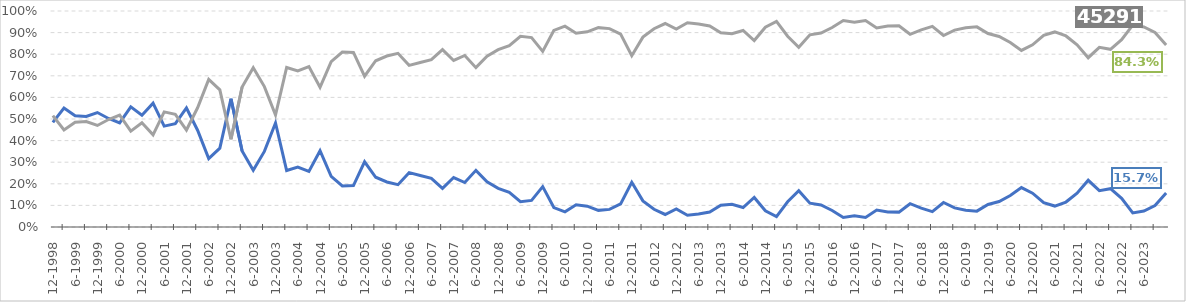
| Category | Belgium | Outside Belgium |
|---|---|---|
| 1998-12-01 | 48.4 | 51.6 |
| 1999-03-01 | 55.05 | 44.95 |
| 1999-06-01 | 51.5 | 48.5 |
| 1999-09-01 | 51.2 | 48.8 |
| 1999-12-01 | 53 | 47 |
| 2000-03-01 | 50.25 | 49.75 |
| 2000-06-01 | 48.2 | 51.8 |
| 2000-09-01 | 55.6 | 44.4 |
| 2000-12-01 | 51.75 | 48.25 |
| 2001-03-01 | 57.35 | 42.65 |
| 2001-06-01 | 46.7 | 53.3 |
| 2001-09-01 | 47.85 | 52.15 |
| 2001-12-01 | 55.1 | 44.9 |
| 2002-03-01 | 44.8 | 55.2 |
| 2002-06-01 | 31.65 | 68.35 |
| 2002-09-01 | 36.5 | 63.5 |
| 2002-12-01 | 59.4 | 40.6 |
| 2003-03-01 | 35.2 | 64.8 |
| 2003-06-01 | 26.25 | 73.75 |
| 2003-09-01 | 35 | 65 |
| 2003-12-01 | 48.15 | 51.85 |
| 2004-03-01 | 26.15 | 73.85 |
| 2004-06-01 | 27.7 | 72.3 |
| 2004-09-01 | 25.7 | 74.3 |
| 2004-12-01 | 35.3 | 64.7 |
| 2005-03-01 | 23.4 | 76.6 |
| 2005-06-01 | 19 | 81 |
| 2005-09-01 | 19.2 | 80.8 |
| 2005-12-01 | 30.2 | 69.8 |
| 2006-03-01 | 23.03 | 76.97 |
| 2006-06-01 | 20.84 | 79.16 |
| 2006-09-01 | 19.6 | 80.4 |
| 2006-12-01 | 25.164 | 74.836 |
| 2007-03-01 | 23.85 | 76.15 |
| 2007-06-01 | 22.5 | 77.5 |
| 2007-09-01 | 17.9 | 82.1 |
| 2007-12-01 | 22.9 | 77.1 |
| 2008-03-01 | 20.602 | 79.398 |
| 2008-06-01 | 26.234 | 73.766 |
| 2008-09-01 | 20.9 | 79.1 |
| 2008-12-01 | 17.9 | 82.1 |
| 2009-03-01 | 16 | 84 |
| 2009-06-01 | 11.75 | 88.25 |
| 2009-09-01 | 12.3 | 87.7 |
| 2009-12-01 | 18.7 | 81.3 |
| 2010-03-01 | 9 | 91 |
| 2010-06-01 | 7 | 93 |
| 2010-09-01 | 10.3 | 89.7 |
| 2010-12-01 | 9.65 | 90.35 |
| 2011-03-01 | 7.7 | 92.3 |
| 2011-06-01 | 8.15 | 91.85 |
| 2011-09-01 | 10.7 | 89.3 |
| 2011-12-01 | 20.7 | 79.3 |
| 2012-03-01 | 12.1 | 87.9 |
| 2012-06-01 | 8.2 | 91.8 |
| 2012-09-01 | 5.8 | 94.2 |
| 2012-12-01 | 8.35 | 91.65 |
| 2013-03-01 | 5.45 | 94.55 |
| 2013-06-01 | 6.05 | 93.95 |
| 2013-09-01 | 6.95 | 93.05 |
| 2013-12-01 | 10.04 | 89.96 |
| 2014-03-01 | 10.545 | 89.455 |
| 2014-06-01 | 9.033 | 90.967 |
| 2014-09-01 | 13.681 | 86.319 |
| 2014-12-01 | 7.498 | 92.502 |
| 2015-03-01 | 4.84 | 95.16 |
| 2015-06-01 | 11.675 | 88.325 |
| 2015-09-01 | 16.8 | 83.2 |
| 2015-12-01 | 11.03 | 88.97 |
| 2016-03-01 | 10.231 | 89.769 |
| 2016-06-01 | 7.665 | 92.335 |
| 2016-09-01 | 4.39 | 95.61 |
| 2016-12-01 | 5.17 | 94.83 |
| 2017-03-01 | 4.4 | 95.6 |
| 2017-06-01 | 7.86 | 92.14 |
| 2017-09-01 | 7 | 93 |
| 2017-12-01 | 6.89 | 93.11 |
| 2018-03-01 | 10.79 | 89.21 |
| 2018-06-01 | 8.7 | 91.3 |
| 2018-09-01 | 7.1 | 92.9 |
| 2018-12-01 | 11.344 | 88.656 |
| 2019-03-01 | 8.854 | 91.146 |
| 2019-06-01 | 7.8 | 92.2 |
| 2019-09-01 | 7.347 | 92.653 |
| 2019-12-01 | 10.43 | 89.57 |
| 2020-03-01 | 11.78 | 88.22 |
| 2020-06-01 | 14.57 | 85.43 |
| 2020-09-01 | 18.25 | 81.75 |
| 2020-12-01 | 15.64 | 84.36 |
| 2021-03-01 | 11.267 | 88.733 |
| 2021-06-01 | 9.7 | 90.3 |
| 2021-09-01 | 11.55 | 88.45 |
| 2021-12-01 | 15.62 | 84.38 |
| 2022-03-01 | 21.63 | 78.37 |
| 2022-06-01 | 16.85 | 83.15 |
| 2022-09-01 | 17.75 | 82.25 |
| 2022-12-01 | 13.31 | 86.69 |
| 2023-03-01 | 6.54 | 93.46 |
| 2023-06-01 | 7.403 | 92.597 |
| 2023-09-01 | 9.923 | 90.077 |
| 2023-12-01 | 15.688 | 84.312 |